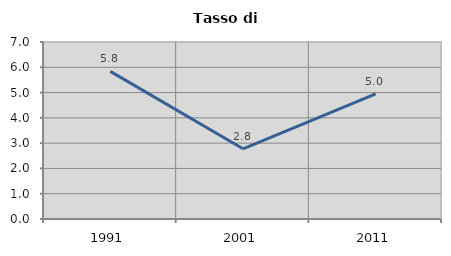
| Category | Tasso di disoccupazione   |
|---|---|
| 1991.0 | 5.839 |
| 2001.0 | 2.778 |
| 2011.0 | 4.95 |